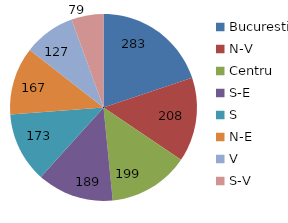
| Category | Series 0 |
|---|---|
| Bucuresti | 283 |
| N-V | 208 |
| Centru | 199 |
| S-E | 189 |
| S  | 173 |
| N-E | 167 |
| V | 127 |
| S-V | 79 |